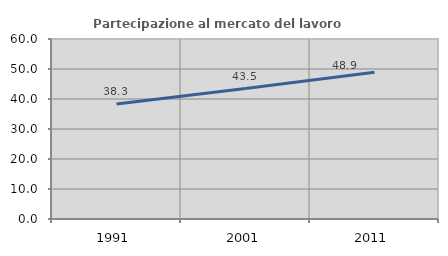
| Category | Partecipazione al mercato del lavoro  femminile |
|---|---|
| 1991.0 | 38.299 |
| 2001.0 | 43.487 |
| 2011.0 | 48.941 |